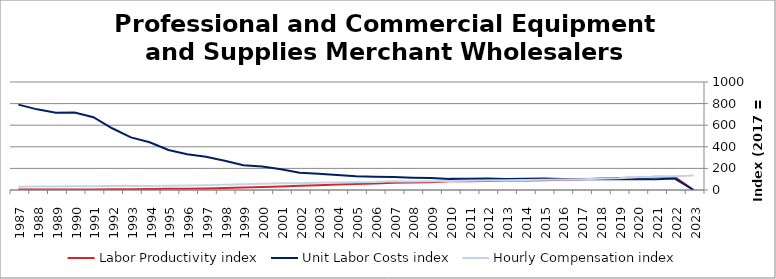
| Category | Labor Productivity index | Unit Labor Costs index | Hourly Compensation index |
|---|---|---|---|
| 2023.0 | 0 | 0 | 133.748 |
| 2022.0 | 121.098 | 105.678 | 127.973 |
| 2021.0 | 123.416 | 99.6 | 122.923 |
| 2020.0 | 114.694 | 102.303 | 117.334 |
| 2019.0 | 110.107 | 98.753 | 108.734 |
| 2018.0 | 105.379 | 99.827 | 105.197 |
| 2017.0 | 100 | 100 | 100 |
| 2016.0 | 94.849 | 102.354 | 97.082 |
| 2015.0 | 90.143 | 106.486 | 95.99 |
| 2014.0 | 88.128 | 104.406 | 92.011 |
| 2013.0 | 87.253 | 103.008 | 89.877 |
| 2012.0 | 83.152 | 106.543 | 88.592 |
| 2011.0 | 81.391 | 105.271 | 85.681 |
| 2010.0 | 80.985 | 103.011 | 83.424 |
| 2009.0 | 71.721 | 111.98 | 80.313 |
| 2008.0 | 69.173 | 114.578 | 79.257 |
| 2007.0 | 66.756 | 120.582 | 80.495 |
| 2006.0 | 59.584 | 123.84 | 73.789 |
| 2005.0 | 55.744 | 127.521 | 71.085 |
| 2004.0 | 50.357 | 138.05 | 69.518 |
| 2003.0 | 43.827 | 150.901 | 66.136 |
| 2002.0 | 39.467 | 159.623 | 62.999 |
| 2001.0 | 32.989 | 191.268 | 63.098 |
| 2000.0 | 26.819 | 216.829 | 58.152 |
| 1999.0 | 23.555 | 229.313 | 54.014 |
| 1998.0 | 18.051 | 270.131 | 48.761 |
| 1997.0 | 14.173 | 307.481 | 43.58 |
| 1996.0 | 12.38 | 330.36 | 40.899 |
| 1995.0 | 10.418 | 371.081 | 38.659 |
| 1994.0 | 8.431 | 441.539 | 37.225 |
| 1993.0 | 7.83 | 486.936 | 38.128 |
| 1992.0 | 6.606 | 571.575 | 37.758 |
| 1991.0 | 5.251 | 674.124 | 35.395 |
| 1990.0 | 4.774 | 716.972 | 34.23 |
| 1989.0 | 4.544 | 715.972 | 32.533 |
| 1988.0 | 4.188 | 746.697 | 31.27 |
| 1987.0 | 3.898 | 790.427 | 30.813 |